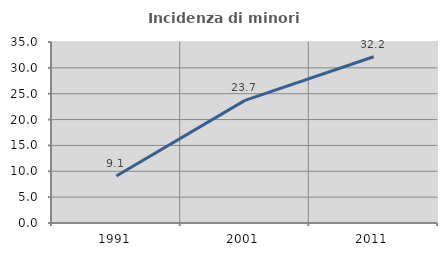
| Category | Incidenza di minori stranieri |
|---|---|
| 1991.0 | 9.091 |
| 2001.0 | 23.711 |
| 2011.0 | 32.155 |